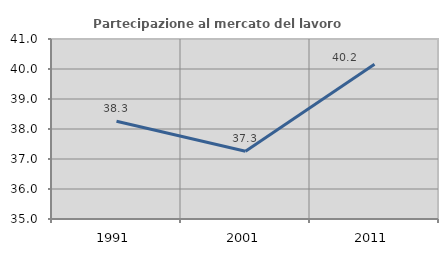
| Category | Partecipazione al mercato del lavoro  femminile |
|---|---|
| 1991.0 | 38.258 |
| 2001.0 | 37.256 |
| 2011.0 | 40.16 |